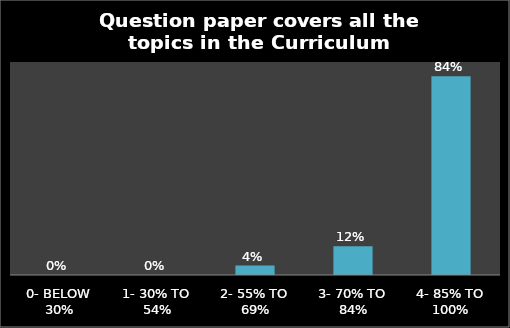
| Category | Series 0 |
|---|---|
| 0- BELOW 30% | 0 |
| 1- 30% TO 54% | 0 |
| 2- 55% TO 69% | 0.04 |
| 3- 70% TO 84% | 0.121 |
| 4- 85% TO 100% | 0.84 |